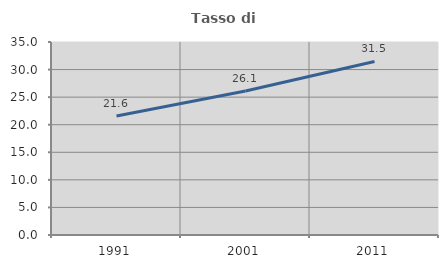
| Category | Tasso di occupazione   |
|---|---|
| 1991.0 | 21.572 |
| 2001.0 | 26.1 |
| 2011.0 | 31.465 |